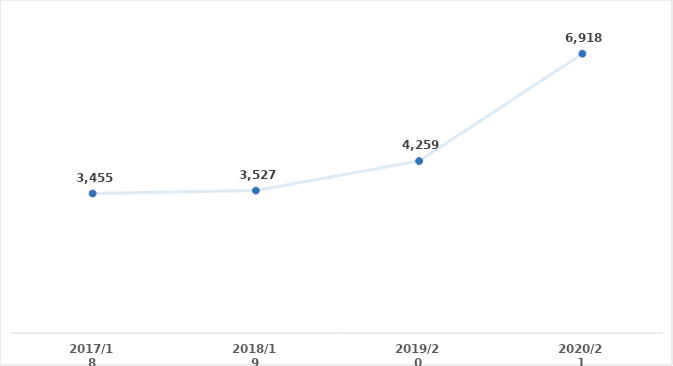
| Category | Total Clients |
|---|---|
| 2017/18 | 3455 |
| 2018/19 | 3527 |
| 2019/20 | 4259 |
| 2020/21 | 6918 |